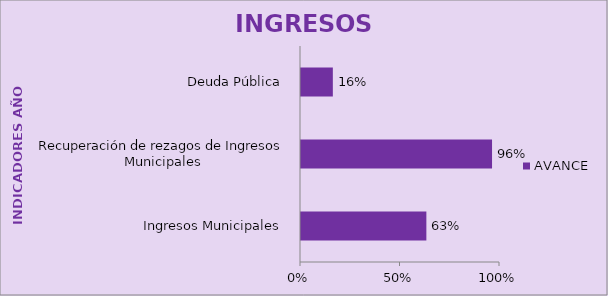
| Category | AVANCE |
|---|---|
| Ingresos Municipales  | 0.63 |
| Recuperación de rezagos de Ingresos Municipales | 0.96 |
| Deuda Pública  | 0.16 |